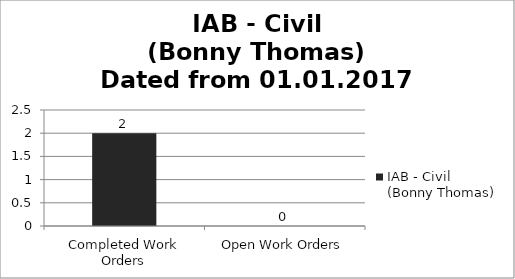
| Category | IAB - Civil (Bonny Thomas) |
|---|---|
| Completed Work Orders | 2 |
| Open Work Orders | 0 |